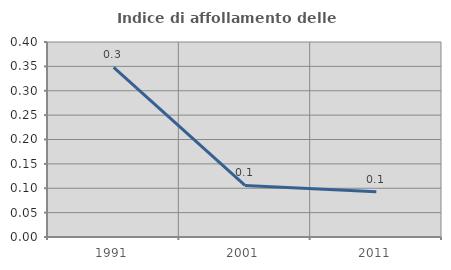
| Category | Indice di affollamento delle abitazioni  |
|---|---|
| 1991.0 | 0.348 |
| 2001.0 | 0.106 |
| 2011.0 | 0.093 |